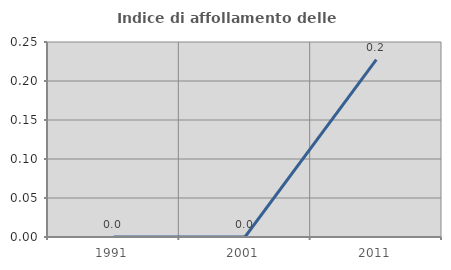
| Category | Indice di affollamento delle abitazioni  |
|---|---|
| 1991.0 | 0 |
| 2001.0 | 0 |
| 2011.0 | 0.227 |